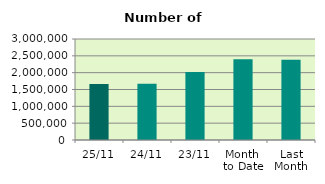
| Category | Series 0 |
|---|---|
| 25/11 | 1665030 |
| 24/11 | 1672668 |
| 23/11 | 2022750 |
| Month 
to Date | 2396884.105 |
| Last
Month | 2382963.143 |